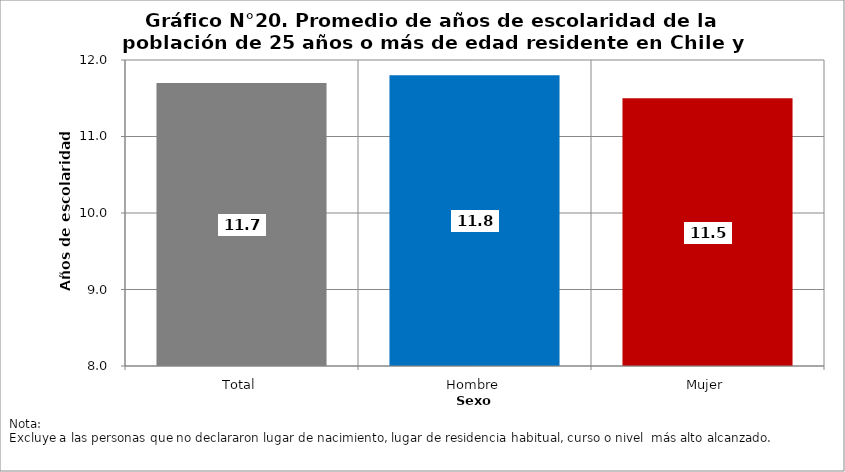
| Category | Series 0 |
|---|---|
| Total | 11.7 |
| Hombre | 11.8 |
| Mujer | 11.5 |